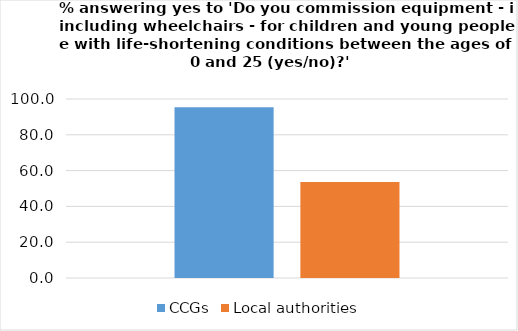
| Category | CCGs | Local authorities |
|---|---|---|
| 0 | 95.455 | 53.6 |